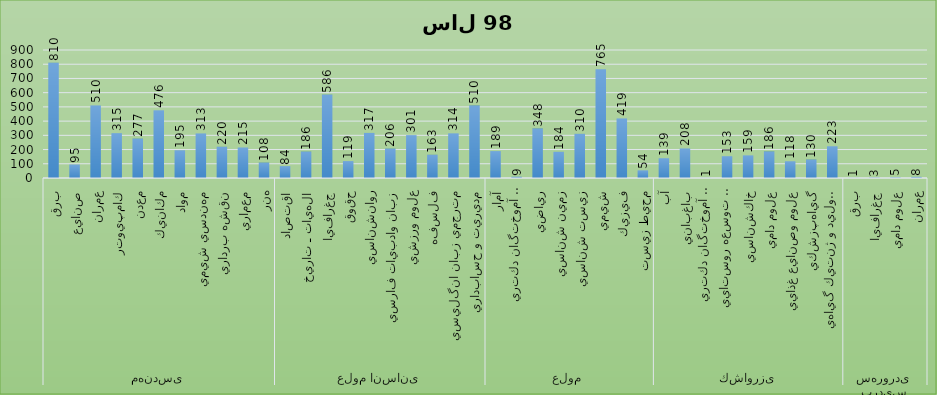
| Category | جمع |
|---|---|
| 0 | 810.168 |
| 1 | 94.929 |
| 2 | 510.391 |
| 3 | 315.303 |
| 4 | 276.713 |
| 5 | 475.921 |
| 6 | 194.982 |
| 7 | 313.366 |
| 8 | 219.521 |
| 9 | 214.507 |
| 10 | 108.198 |
| 11 | 83.728 |
| 12 | 185.531 |
| 13 | 586.109 |
| 14 | 118.873 |
| 15 | 316.891 |
| 16 | 206.488 |
| 17 | 301.359 |
| 18 | 163.331 |
| 19 | 313.946 |
| 20 | 509.743 |
| 21 | 189.162 |
| 22 | 8.766 |
| 23 | 347.94 |
| 24 | 183.809 |
| 25 | 310.323 |
| 26 | 765.133 |
| 27 | 418.914 |
| 28 | 53.953 |
| 29 | 139.089 |
| 30 | 207.932 |
| 31 | 0.989 |
| 32 | 153.26 |
| 33 | 159.149 |
| 34 | 186.276 |
| 35 | 117.687 |
| 36 | 129.523 |
| 37 | 223.095 |
| 38 | 1 |
| 39 | 3 |
| 40 | 5 |
| 41 | 8 |